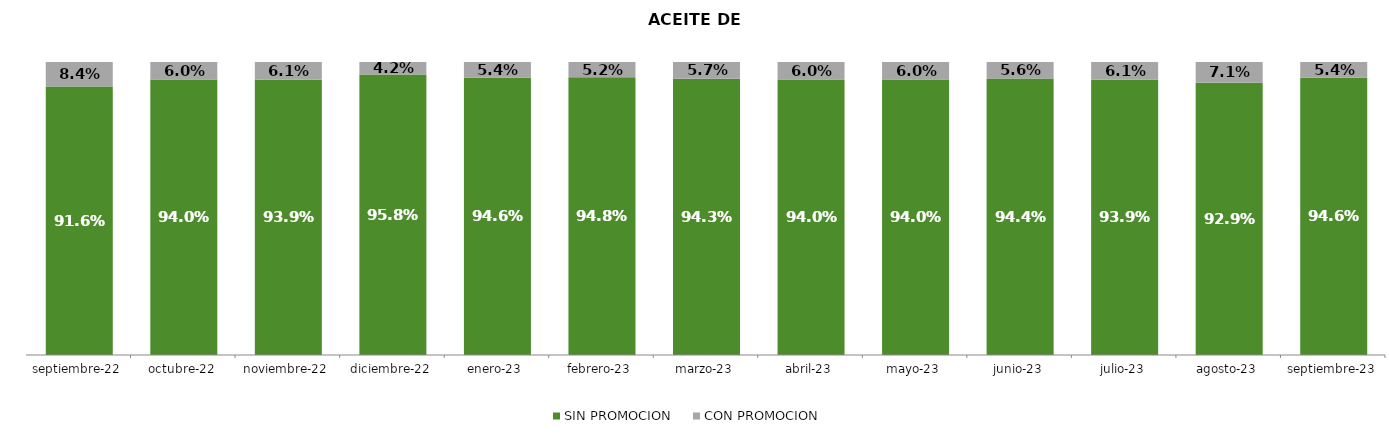
| Category | SIN PROMOCION   | CON PROMOCION   |
|---|---|---|
| 2022-09-01 | 0.916 | 0.084 |
| 2022-10-01 | 0.94 | 0.06 |
| 2022-11-01 | 0.939 | 0.061 |
| 2022-12-01 | 0.958 | 0.042 |
| 2023-01-01 | 0.946 | 0.054 |
| 2023-02-01 | 0.948 | 0.052 |
| 2023-03-01 | 0.943 | 0.057 |
| 2023-04-01 | 0.94 | 0.06 |
| 2023-05-01 | 0.94 | 0.06 |
| 2023-06-01 | 0.944 | 0.056 |
| 2023-07-01 | 0.939 | 0.061 |
| 2023-08-01 | 0.929 | 0.071 |
| 2023-09-01 | 0.946 | 0.054 |